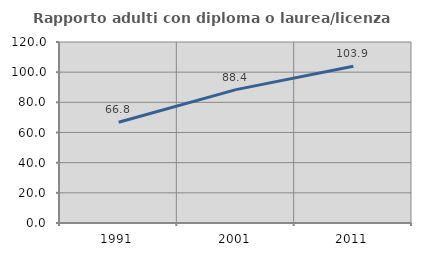
| Category | Rapporto adulti con diploma o laurea/licenza media  |
|---|---|
| 1991.0 | 66.818 |
| 2001.0 | 88.421 |
| 2011.0 | 103.873 |